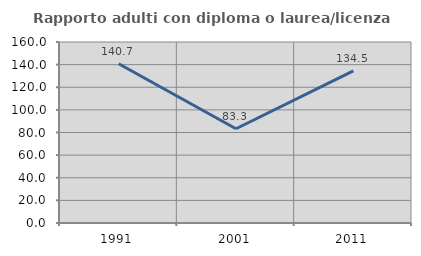
| Category | Rapporto adulti con diploma o laurea/licenza media  |
|---|---|
| 1991.0 | 140.741 |
| 2001.0 | 83.333 |
| 2011.0 | 134.545 |